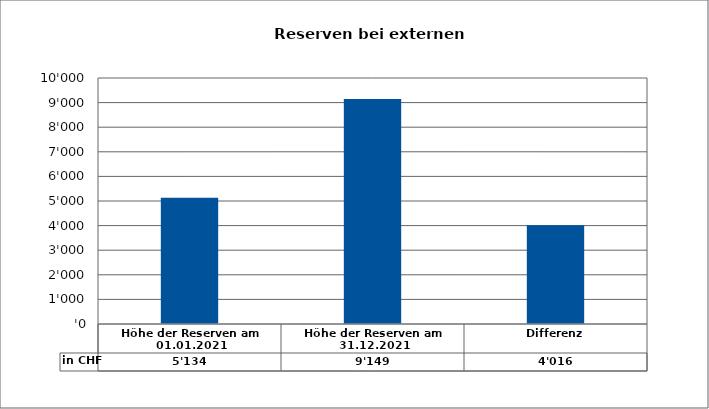
| Category | in CHF |
|---|---|
| Höhe der Reserven am 01.01.2021 | 5133.566 |
| Höhe der Reserven am 31.12.2021 | 9149.46 |
| Differenz | 4015.895 |